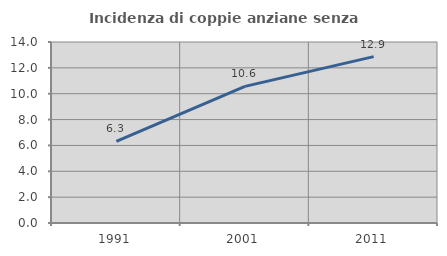
| Category | Incidenza di coppie anziane senza figli  |
|---|---|
| 1991.0 | 6.317 |
| 2001.0 | 10.57 |
| 2011.0 | 12.869 |